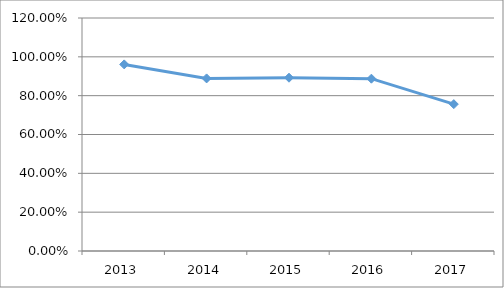
| Category | PRFA-D5O02 |
|---|---|
| 2013.0 | 0.961 |
| 2014.0 | 0.889 |
| 2015.0 | 0.892 |
| 2016.0 | 0.888 |
| 2017.0 | 0.756 |